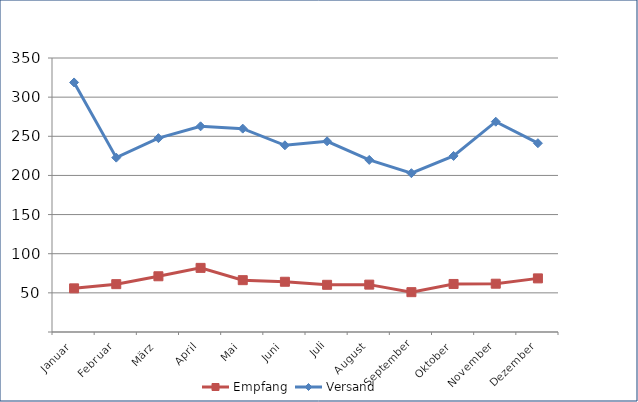
| Category | Empfang | Versand |
|---|---|---|
| Januar | 55.746 | 318.776 |
| Februar | 61.118 | 222.738 |
| März | 71.183 | 247.612 |
| April | 81.911 | 262.726 |
| Mai | 66.222 | 259.767 |
| Juni | 64.173 | 238.475 |
| Juli | 60.282 | 243.613 |
| August | 60.513 | 219.822 |
| September | 50.895 | 202.871 |
| Oktober | 61.356 | 224.887 |
| November | 61.689 | 268.619 |
| Dezember | 68.493 | 241.179 |